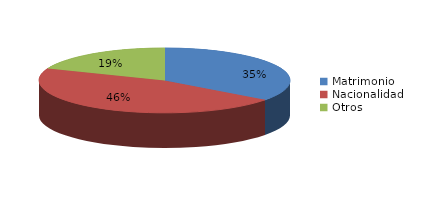
| Category | Series 0 |
|---|---|
| Matrimonio | 340 |
| Nacionalidad | 442 |
| Otros | 183 |